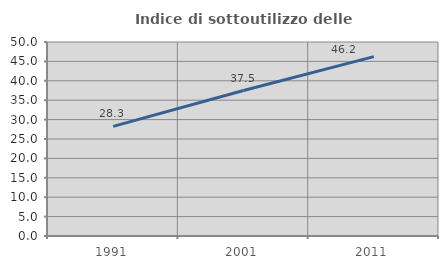
| Category | Indice di sottoutilizzo delle abitazioni  |
|---|---|
| 1991.0 | 28.263 |
| 2001.0 | 37.483 |
| 2011.0 | 46.237 |